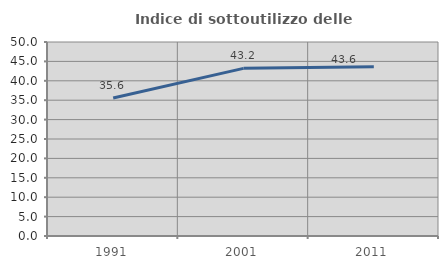
| Category | Indice di sottoutilizzo delle abitazioni  |
|---|---|
| 1991.0 | 35.562 |
| 2001.0 | 43.21 |
| 2011.0 | 43.646 |